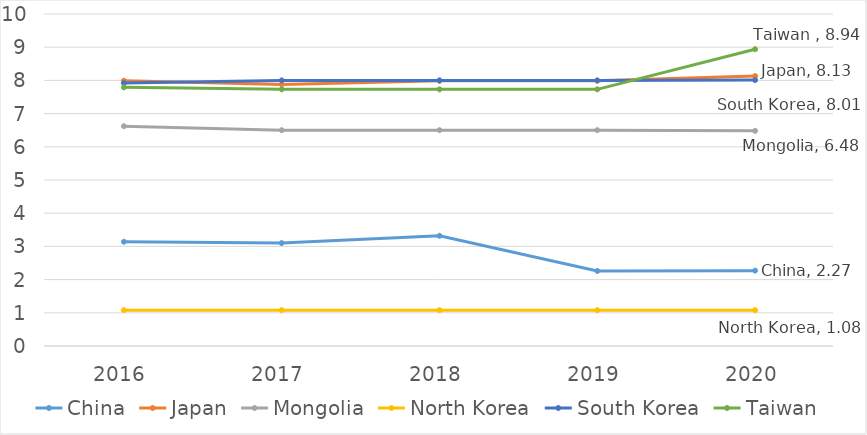
| Category | China | Japan | Mongolia | North Korea | South Korea | Taiwan  |
|---|---|---|---|---|---|---|
| 2016.0 | 3.14 | 7.99 | 6.62 | 1.08 | 7.92 | 7.79 |
| 2017.0 | 3.1 | 7.88 | 6.5 | 1.08 | 8 | 7.73 |
| 2018.0 | 3.32 | 7.99 | 6.5 | 1.08 | 8 | 7.73 |
| 2019.0 | 2.26 | 7.99 | 6.5 | 1.08 | 8 | 7.73 |
| 2020.0 | 2.27 | 8.13 | 6.48 | 1.08 | 8.01 | 8.94 |